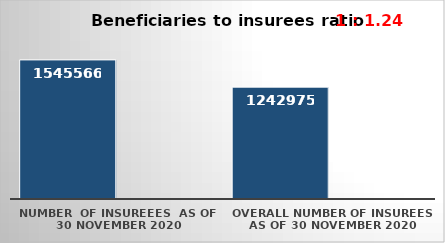
| Category | Series 0 | Series 1 |
|---|---|---|
| NUMBER  of insureees  as of  30 November 2020 | 1545566 |  |
| OVERALL number of insurees as of 30 November 2020 | 1242975 |  |